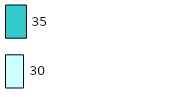
| Category | Series 0 | Series 1 |
|---|---|---|
| 0 | 30 | 35 |